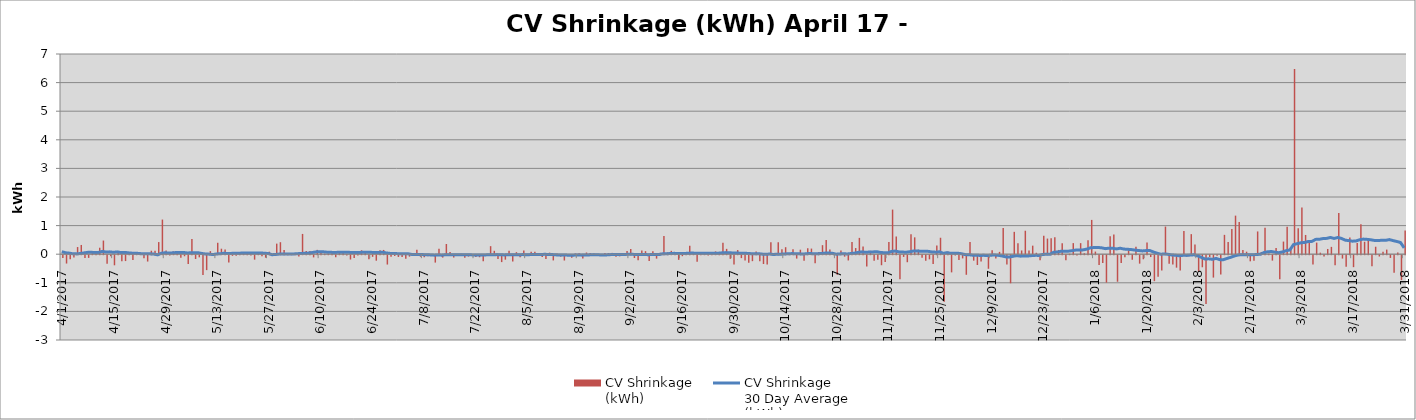
| Category | CV Shrinkage
(kWh) |
|---|---|
| 4/1/17 | -97351.979 |
| 4/2/17 | -291663.896 |
| 4/3/17 | -139928.851 |
| 4/4/17 | -77442.176 |
| 4/5/17 | 250451.457 |
| 4/6/17 | 323264.401 |
| 4/7/17 | -99347.374 |
| 4/8/17 | -94164.301 |
| 4/9/17 | 57910.581 |
| 4/10/17 | 39599.551 |
| 4/11/17 | 226881.371 |
| 4/12/17 | 477279.639 |
| 4/13/17 | -300139.284 |
| 4/14/17 | -40689.891 |
| 4/15/17 | -353109.715 |
| 4/16/17 | 106459.698 |
| 4/17/17 | -209079.676 |
| 4/18/17 | -205146.879 |
| 4/19/17 | 79883.097 |
| 4/20/17 | -169936.893 |
| 4/21/17 | 22495.556 |
| 4/22/17 | 47836.724 |
| 4/23/17 | -109046.558 |
| 4/24/17 | -221783.21 |
| 4/25/17 | 121779.692 |
| 4/26/17 | 117365.733 |
| 4/27/17 | 424047.009 |
| 4/28/17 | 1211131.277 |
| 4/29/17 | 127003.131 |
| 4/30/17 | -10746.633 |
| 5/1/17 | 99207.743 |
| 5/2/17 | 63765.46 |
| 5/3/17 | -88086.162 |
| 5/4/17 | -36460.668 |
| 5/5/17 | -309633.34 |
| 5/6/17 | 529581.837 |
| 5/7/17 | -133746.214 |
| 5/8/17 | -74457.798 |
| 5/9/17 | -695563.424 |
| 5/10/17 | -522046.318 |
| 5/11/17 | 106778.795 |
| 5/12/17 | 8469.635 |
| 5/13/17 | 399457.086 |
| 5/14/17 | 192198.611 |
| 5/15/17 | 164008.356 |
| 5/16/17 | -254872.282 |
| 5/17/17 | -22297.808 |
| 5/18/17 | -15910.832 |
| 5/19/17 | 61205.278 |
| 5/20/17 | 43402.247 |
| 5/21/17 | 19652.165 |
| 5/22/17 | -10960.209 |
| 5/23/17 | -155742.917 |
| 5/24/17 | 32691.988 |
| 5/25/17 | -34592.275 |
| 5/26/17 | -87478.227 |
| 5/27/17 | 88012.555 |
| 5/28/17 | -2264.886 |
| 5/29/17 | 369617.028 |
| 5/30/17 | 419599.167 |
| 5/31/17 | 150892.222 |
| 6/1/17 | 11891.667 |
| 6/2/17 | 24124.722 |
| 6/3/17 | 12942.5 |
| 6/4/17 | -49292.69 |
| 6/5/17 | 709145.556 |
| 6/6/17 | 109817.722 |
| 6/7/17 | 107910.556 |
| 6/8/17 | -77041.947 |
| 6/9/17 | 151690.278 |
| 6/10/17 | 91521.111 |
| 6/11/17 | 16567.945 |
| 6/12/17 | 20783.086 |
| 6/13/17 | 78618.767 |
| 6/14/17 | -71652.897 |
| 6/15/17 | 54646.502 |
| 6/16/17 | 57508.864 |
| 6/17/17 | -13986.667 |
| 6/18/17 | -151108.583 |
| 6/19/17 | -97742.722 |
| 6/20/17 | -9848.786 |
| 6/21/17 | 137391.532 |
| 6/22/17 | 62504.773 |
| 6/23/17 | -142015.786 |
| 6/24/17 | -57277.931 |
| 6/25/17 | -192040.988 |
| 6/26/17 | 141903.112 |
| 6/27/17 | 149299.243 |
| 6/28/17 | -326664.108 |
| 6/29/17 | -55838.29 |
| 6/30/17 | -26838.832 |
| 7/1/17 | -61493.861 |
| 7/2/17 | -60926.027 |
| 7/3/17 | -125608.006 |
| 7/4/17 | -49865.547 |
| 7/5/17 | 9373.92 |
| 7/6/17 | 157213.237 |
| 7/7/17 | -54945.944 |
| 7/8/17 | -69098.662 |
| 7/9/17 | -33167.558 |
| 7/10/17 | -21072.299 |
| 7/11/17 | -258675.137 |
| 7/12/17 | 191623.424 |
| 7/13/17 | -83704.722 |
| 7/14/17 | 356818.889 |
| 7/15/17 | 74461.111 |
| 7/16/17 | -82026.61 |
| 7/17/17 | 7491.596 |
| 7/18/17 | 15643.734 |
| 7/19/17 | -87426.402 |
| 7/20/17 | -47740.129 |
| 7/21/17 | -17464.999 |
| 7/22/17 | -63576.388 |
| 7/23/17 | -71818.899 |
| 7/24/17 | -214728.438 |
| 7/25/17 | -14873.45 |
| 7/26/17 | 281172.608 |
| 7/27/17 | 118368.874 |
| 7/28/17 | -134160.326 |
| 7/29/17 | -241133.855 |
| 7/30/17 | -156198.21 |
| 7/31/17 | 119589.882 |
| 8/1/17 | -217194.096 |
| 8/2/17 | 70588.889 |
| 8/3/17 | -68438.056 |
| 8/4/17 | 125104.172 |
| 8/5/17 | 8357.492 |
| 8/6/17 | 84740.216 |
| 8/7/17 | 88648.889 |
| 8/8/17 | 10970.861 |
| 8/9/17 | -58817.778 |
| 8/10/17 | -134061.433 |
| 8/11/17 | 53710.217 |
| 8/12/17 | -182780.774 |
| 8/13/17 | 28538.39 |
| 8/14/17 | -51581.26 |
| 8/15/17 | -186015.315 |
| 8/16/17 | -29032.869 |
| 8/17/17 | -91456.512 |
| 8/18/17 | 23726.544 |
| 8/19/17 | 36591.402 |
| 8/20/17 | -113732.882 |
| 8/21/17 | 58413.568 |
| 8/22/17 | 43489.37 |
| 8/23/17 | 27842.156 |
| 8/24/17 | -4814.82 |
| 8/25/17 | -7492.63 |
| 8/26/17 | 44388.424 |
| 8/27/17 | 40726.673 |
| 8/28/17 | 45794.025 |
| 8/29/17 | -54872.904 |
| 8/30/17 | -39737.535 |
| 8/31/17 | -22245.978 |
| 9/1/17 | 109340.156 |
| 9/2/17 | 183208.977 |
| 9/3/17 | -97515.563 |
| 9/4/17 | -176850.335 |
| 9/5/17 | 132972.769 |
| 9/6/17 | 106573.827 |
| 9/7/17 | -202592.33 |
| 9/8/17 | 104154.667 |
| 9/9/17 | -120338.516 |
| 9/10/17 | 47739.135 |
| 9/11/17 | 635057.777 |
| 9/12/17 | 66651.398 |
| 9/13/17 | 117600.679 |
| 9/14/17 | 31961.659 |
| 9/15/17 | -162746.242 |
| 9/16/17 | -34105.892 |
| 9/17/17 | 1108.379 |
| 9/18/17 | 293671.615 |
| 9/19/17 | 58096.424 |
| 9/20/17 | -232248.176 |
| 9/21/17 | 20199.832 |
| 9/22/17 | 59445.635 |
| 9/23/17 | -13055.278 |
| 9/24/17 | 48677.841 |
| 9/25/17 | 98096.112 |
| 9/26/17 | 53672.023 |
| 9/27/17 | 403402.667 |
| 9/28/17 | 186513.831 |
| 9/29/17 | -126490.99 |
| 9/30/17 | -322254.177 |
| 10/1/17 | 145308.644 |
| 10/2/17 | -101531.771 |
| 10/3/17 | -182287.389 |
| 10/4/17 | -267628.326 |
| 10/5/17 | -208734.314 |
| 10/6/17 | 90949.832 |
| 10/7/17 | -212580.508 |
| 10/8/17 | -308768.206 |
| 10/9/17 | -327636.682 |
| 10/10/17 | 414902.472 |
| 10/11/17 | 46343.25 |
| 10/12/17 | 417941.886 |
| 10/13/17 | 174731.321 |
| 10/14/17 | 244820.377 |
| 10/15/17 | 15160.282 |
| 10/16/17 | 169944.534 |
| 10/17/17 | -118671.298 |
| 10/18/17 | 157323.929 |
| 10/19/17 | -195984.318 |
| 10/20/17 | 208217.364 |
| 10/21/17 | 196371.082 |
| 10/22/17 | -285335.414 |
| 10/23/17 | 76806.989 |
| 10/24/17 | 316089.747 |
| 10/25/17 | 497579.612 |
| 10/26/17 | 167460.537 |
| 10/27/17 | 18006.962 |
| 10/28/17 | -680538.584 |
| 10/29/17 | 129367.875 |
| 10/30/17 | -50784.999 |
| 10/31/17 | -184044.666 |
| 11/1/17 | 422523.623 |
| 11/2/17 | 215181.681 |
| 11/3/17 | 570707.476 |
| 11/4/17 | 267671.506 |
| 11/5/17 | -395920.8 |
| 11/6/17 | 116529.188 |
| 11/7/17 | -192075.731 |
| 11/8/17 | -157746.626 |
| 11/9/17 | -350585.464 |
| 11/10/17 | -241148.585 |
| 11/11/17 | 430417.323 |
| 11/12/17 | 1559798.95 |
| 11/13/17 | 616555.179 |
| 11/14/17 | -841733.346 |
| 11/15/17 | -60180.376 |
| 11/16/17 | -245691.83 |
| 11/17/17 | 701636.739 |
| 11/18/17 | 589463.76 |
| 11/19/17 | 158535.276 |
| 11/20/17 | -92008.985 |
| 11/21/17 | -193623.209 |
| 11/22/17 | -145027.341 |
| 11/23/17 | -304357.522 |
| 11/24/17 | 304667.225 |
| 11/25/17 | 575152.183 |
| 11/26/17 | -1631241.228 |
| 11/27/17 | 93245.75 |
| 11/28/17 | -600580.019 |
| 11/29/17 | -8689.373 |
| 11/30/17 | -167618.229 |
| 12/1/17 | -112129.921 |
| 12/2/17 | -684593.29 |
| 12/3/17 | 423823.035 |
| 12/4/17 | -190990.836 |
| 12/5/17 | -343631.866 |
| 12/6/17 | -222172.843 |
| 12/7/17 | -33806.24 |
| 12/8/17 | -474689.955 |
| 12/9/17 | 134716.078 |
| 12/10/17 | -114733.308 |
| 12/11/17 | 81776.386 |
| 12/12/17 | 914368.352 |
| 12/13/17 | -326652.936 |
| 12/14/17 | -981789.518 |
| 12/15/17 | 781574.513 |
| 12/16/17 | 385956.514 |
| 12/17/17 | 130481.536 |
| 12/18/17 | 820249.926 |
| 12/19/17 | 126067.682 |
| 12/20/17 | 298658.149 |
| 12/21/17 | 50208.684 |
| 12/22/17 | -174593.935 |
| 12/23/17 | 644358.398 |
| 12/24/17 | 546371.398 |
| 12/25/17 | 554307.817 |
| 12/26/17 | 596982.315 |
| 12/27/17 | 148680.592 |
| 12/28/17 | 381906.79 |
| 12/29/17 | -179342.93 |
| 12/30/17 | 17062.095 |
| 12/31/17 | 387788.274 |
| 1/1/18 | -11317.323 |
| 1/2/18 | 386837.343 |
| 1/3/18 | 34374.83 |
| 1/4/18 | 489688.86 |
| 1/5/18 | 1199031.157 |
| 1/6/18 | 91608.476 |
| 1/7/18 | -344437.742 |
| 1/8/18 | -275697.312 |
| 1/9/18 | -958324.594 |
| 1/10/18 | 630871.577 |
| 1/11/18 | 691291.467 |
| 1/12/18 | -927516.316 |
| 1/13/18 | -276872.466 |
| 1/14/18 | -75907.15 |
| 1/15/18 | 137710.258 |
| 1/16/18 | -159529.497 |
| 1/17/18 | 257122.202 |
| 1/18/18 | -294945.872 |
| 1/19/18 | -142044.09 |
| 1/20/18 | 408241.574 |
| 1/21/18 | -64987.983 |
| 1/22/18 | -907689.224 |
| 1/23/18 | -751378.756 |
| 1/24/18 | -537069.81 |
| 1/25/18 | 966003.18 |
| 1/26/18 | -299973.873 |
| 1/27/18 | -322353.451 |
| 1/28/18 | -435590.893 |
| 1/29/18 | -532522.052 |
| 1/30/18 | 815331.507 |
| 1/31/18 | -42445.652 |
| 2/1/18 | 701614.475 |
| 2/2/18 | 337673.643 |
| 2/3/18 | -587665.392 |
| 2/4/18 | -421687.224 |
| 2/5/18 | -1705872.361 |
| 2/6/18 | -62653.5 |
| 2/7/18 | -782531.434 |
| 2/8/18 | -23203.244 |
| 2/9/18 | -674574.325 |
| 2/10/18 | 676654.617 |
| 2/11/18 | 426173.405 |
| 2/12/18 | 877550.562 |
| 2/13/18 | 1348432.212 |
| 2/14/18 | 1128626.271 |
| 2/15/18 | 147960.75 |
| 2/16/18 | 88158.639 |
| 2/17/18 | -213631.586 |
| 2/18/18 | -194339.345 |
| 2/19/18 | 795576.724 |
| 2/20/18 | 78830.531 |
| 2/21/18 | 921578.757 |
| 2/22/18 | 19272.48 |
| 2/23/18 | -189000.029 |
| 2/24/18 | 217096.478 |
| 2/25/18 | -838944.669 |
| 2/26/18 | 441875.418 |
| 2/27/18 | 960701.962 |
| 2/28/18 | 187569.429 |
| 3/1/18 | 6475884.819 |
| 3/2/18 | 905463.335 |
| 3/3/18 | 1631669.212 |
| 3/4/18 | 672934.208 |
| 3/5/18 | 441359.719 |
| 3/6/18 | -326807.959 |
| 3/7/18 | 405746.104 |
| 3/8/18 | 53594.714 |
| 3/9/18 | -42239.433 |
| 3/10/18 | 183166.471 |
| 3/11/18 | 256516.502 |
| 3/12/18 | -353858.467 |
| 3/13/18 | 1440796.16 |
| 3/14/18 | -117728.127 |
| 3/15/18 | -407541.163 |
| 3/16/18 | 581408.909 |
| 3/17/18 | -417869.495 |
| 3/18/18 | 388890.28 |
| 3/19/18 | 1050787.403 |
| 3/20/18 | 435082.461 |
| 3/21/18 | 487924.74 |
| 3/22/18 | -386723.398 |
| 3/23/18 | 261173.935 |
| 3/24/18 | -45664.483 |
| 3/25/18 | 87431.264 |
| 3/26/18 | 160980.797 |
| 3/27/18 | -95698.036 |
| 3/28/18 | -615906.506 |
| 3/29/18 | 59012.784 |
| 3/30/18 | -870712.456 |
| 3/31/18 | 825618.998 |